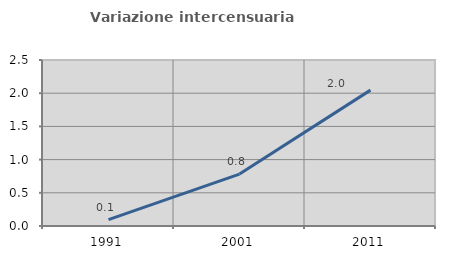
| Category | Variazione intercensuaria annua |
|---|---|
| 1991.0 | 0.097 |
| 2001.0 | 0.782 |
| 2011.0 | 2.046 |